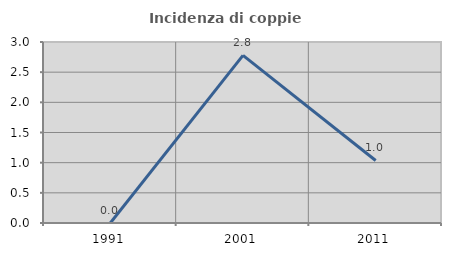
| Category | Incidenza di coppie miste |
|---|---|
| 1991.0 | 0 |
| 2001.0 | 2.778 |
| 2011.0 | 1.036 |